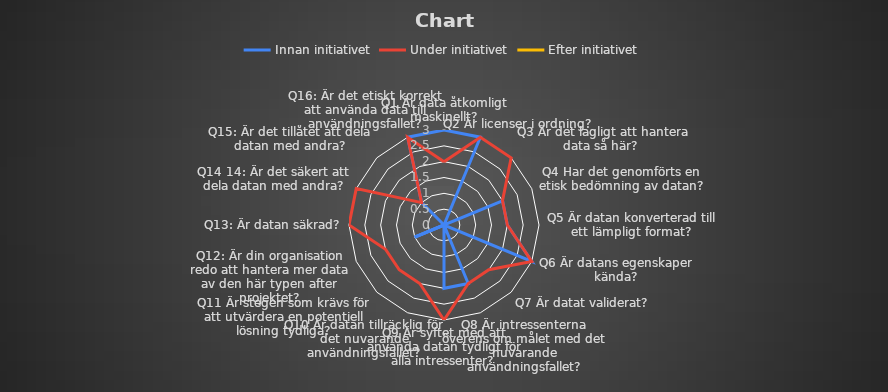
| Category | Innan initiativet | Under initiativet | Efter initiativet |
|---|---|---|---|
| Q1 Är data åtkomligt maskinellt? | 3 | 2 | 0 |
| Q2 Är licenser i ordning?  | 3 | 3 | 0 |
| Q3 Är det lagligt att hantera data så här?  | 0 | 3 | 0 |
| Q4 Har det genomförts en etisk bedömning av datan? | 2 | 2 | 0 |
| Q5 Är datan konverterad till ett lämpligt format? | 2 | 2 | 0 |
| Q6 Är datans egenskaper kända? | 3 | 3 | 0 |
| Q7 Är datat validerat?  | 0 | 2 | 0 |
| Q8 Är intressenterna överens om målet med det nuvarande användningsfallet? | 2 | 2 | 0 |
| Q9 Är syftet med att använda datan tydligt för alla intressenter? | 2 | 3 | 0 |
| Q10 Är datan tillräcklig för det nuvarande användningsfallet? | 0 | 2 | 0 |
| Q11 Är stegen som krävs för att utvärdera en potentiell lösning tydliga? | 0 | 2 | 0 |
| Q12: Är din organisation redo att hantera mer data av den här typen after projektet? | 1 | 2 | 0 |
| Q13: Är datan säkrad? | 0 | 3 | 0 |
| Q14 14: Är det säkert att dela datan med andra? | 0 | 3 | 0 |
| Q15: Är det tillåtet att dela datan med andra? | 1 | 1 | 0 |
| Q16: Är det etiskt korrekt att använda data till användningsfallet? | 3 | 3 | 0 |